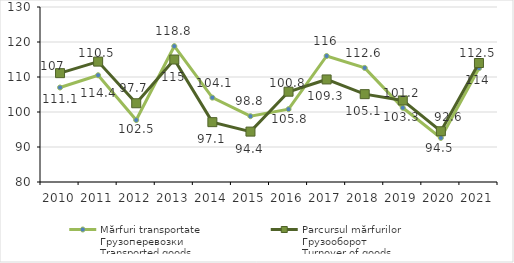
| Category | Mărfuri transportate
Грузоперевозки
Transported goods | Parcursul mărfurilor
Грузооборот
Turnover of goods |
|---|---|---|
| 2010.0 | 107 | 111.1 |
| 2011.0 | 110.5 | 114.4 |
| 2012.0 | 97.7 | 102.5 |
| 2013.0 | 118.8 | 115 |
| 2014.0 | 104.1 | 97.1 |
| 2015.0 | 98.8 | 94.4 |
| 2016.0 | 100.8 | 105.8 |
| 2017.0 | 116 | 109.3 |
| 2018.0 | 112.6 | 105.1 |
| 2019.0 | 101.2 | 103.3 |
| 2020.0 | 92.6 | 94.5 |
| 2021.0 | 112.5 | 114 |